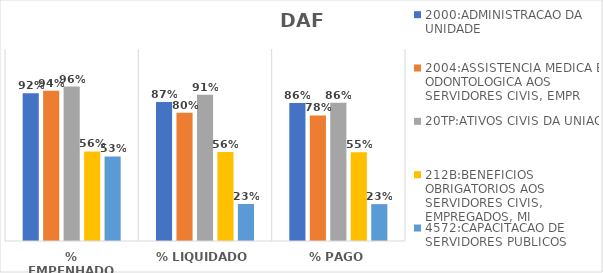
| Category | 2000:ADMINISTRACAO DA UNIDADE | 2004:ASSISTENCIA MEDICA E ODONTOLOGICA AOS SERVIDORES CIVIS, EMPR | 20TP:ATIVOS CIVIS DA UNIAO | 212B:BENEFICIOS OBRIGATORIOS AOS SERVIDORES CIVIS, EMPREGADOS, MI | 4572:CAPACITACAO DE SERVIDORES PUBLICOS FEDERAIS EM PROCESSO DE Q |
|---|---|---|---|---|---|
| % EMPENHADO | 0.923 | 0.939 | 0.965 | 0.56 | 0.529 |
| % LIQUIDADO | 0.868 | 0.801 | 0.914 | 0.556 | 0.231 |
| % PAGO | 0.863 | 0.784 | 0.864 | 0.554 | 0.23 |